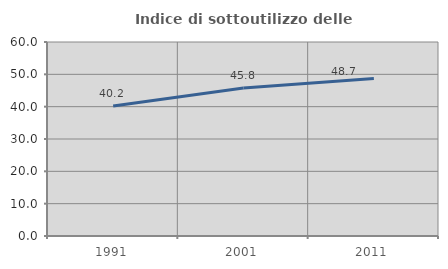
| Category | Indice di sottoutilizzo delle abitazioni  |
|---|---|
| 1991.0 | 40.188 |
| 2001.0 | 45.792 |
| 2011.0 | 48.695 |